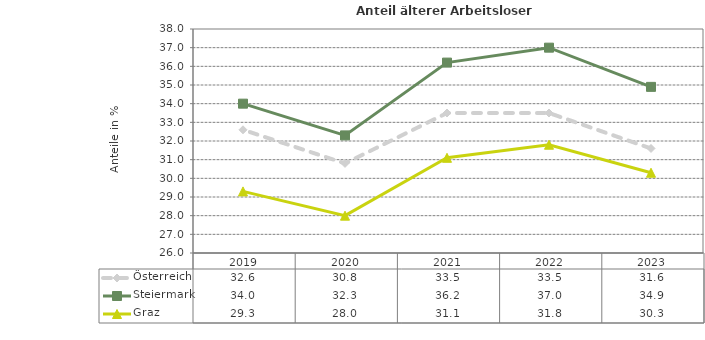
| Category | Österreich | Steiermark | Graz |
|---|---|---|---|
| 2023.0 | 31.6 | 34.9 | 30.3 |
| 2022.0 | 33.5 | 37 | 31.8 |
| 2021.0 | 33.5 | 36.2 | 31.1 |
| 2020.0 | 30.8 | 32.3 | 28 |
| 2019.0 | 32.6 | 34 | 29.3 |